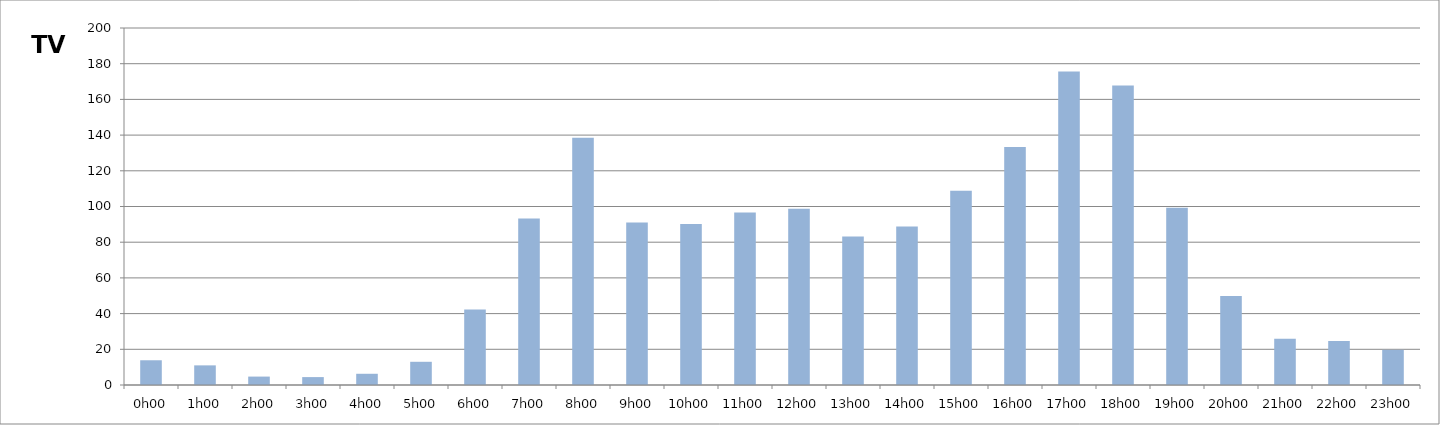
| Category | TV |
|---|---|
| 0.0 | 13.857 |
| 0.041666666666666664 | 11 |
| 0.08333333333333333 | 4.714 |
| 0.125 | 4.429 |
| 0.16666666666666666 | 6.286 |
| 0.20833333333333334 | 13 |
| 0.25 | 42.286 |
| 0.2916666666666667 | 93.286 |
| 0.3333333333333333 | 138.571 |
| 0.375 | 91 |
| 0.4166666666666667 | 90.143 |
| 0.4583333333333333 | 96.571 |
| 0.5 | 98.714 |
| 0.5416666666666666 | 83.143 |
| 0.5833333333333334 | 88.857 |
| 0.625 | 108.857 |
| 0.6666666666666666 | 133.286 |
| 0.7083333333333334 | 175.571 |
| 0.75 | 167.857 |
| 0.7916666666666666 | 99.286 |
| 0.8333333333333334 | 49.857 |
| 0.875 | 25.857 |
| 0.9166666666666666 | 24.714 |
| 0.9583333333333334 | 19.714 |